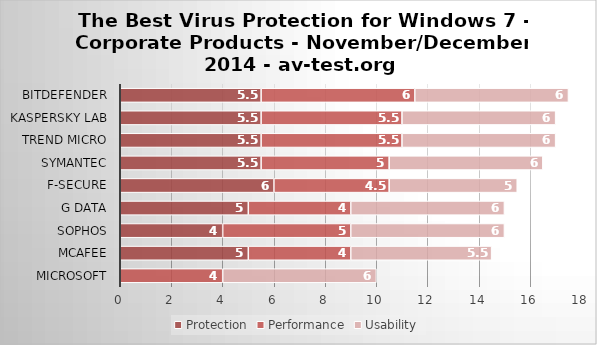
| Category | Protection | Performance | Usability |
|---|---|---|---|
| Microsoft | 0 | 4 | 6 |
| McAfee | 5 | 4 | 5.5 |
| Sophos | 4 | 5 | 6 |
| G Data | 5 | 4 | 6 |
| F-Secure | 6 | 4.5 | 5 |
| Symantec | 5.5 | 5 | 6 |
| Trend Micro | 5.5 | 5.5 | 6 |
| Kaspersky Lab | 5.5 | 5.5 | 6 |
| Bitdefender | 5.5 | 6 | 6 |